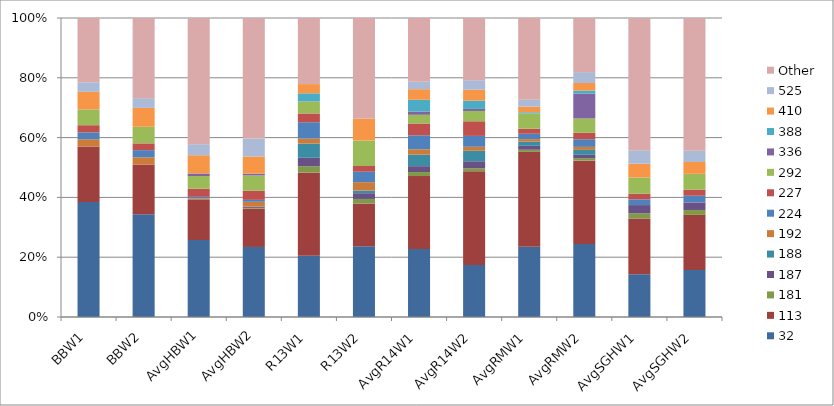
| Category | 32 | 113 | 181 | 187 | 188 | 192 | 224 | 227 | 292 | 336 | 388 | 410 | 525 | Other |
|---|---|---|---|---|---|---|---|---|---|---|---|---|---|---|
| BBW1 | 0.384 | 0.186 | 0 | 0 | 0 | 0.024 | 0.023 | 0.024 | 0.053 | 0 | 0 | 0.059 | 0.032 | 0.215 |
| BBW2 | 0.343 | 0.167 | 0 | 0 | 0 | 0.024 | 0.024 | 0.023 | 0.056 | 0 | 0 | 0.063 | 0.032 | 0.268 |
| AvgHBW1 | 0.258 | 0.134 | 0.001 | 0.002 | 0 | 0.003 | 0.004 | 0.027 | 0.043 | 0.008 | 0 | 0.061 | 0.037 | 0.422 |
| AvgHBW2 | 0.234 | 0.129 | 0.002 | 0.003 | 0.001 | 0.016 | 0.006 | 0.03 | 0.051 | 0.006 | 0 | 0.057 | 0.06 | 0.403 |
| R13W1 | 0.205 | 0.279 | 0.02 | 0.028 | 0.047 | 0.017 | 0.055 | 0.029 | 0.04 | 0 | 0.027 | 0.031 | 0 | 0.221 |
| R13W2 | 0.236 | 0.143 | 0.015 | 0.019 | 0.009 | 0.028 | 0.035 | 0.019 | 0.085 | 0 | 0 | 0.072 | 0 | 0.337 |
| AvgR14W1 | 0.228 | 0.244 | 0.013 | 0.02 | 0.038 | 0.018 | 0.047 | 0.04 | 0.029 | 0.011 | 0.039 | 0.035 | 0.025 | 0.213 |
| AvgR14W2 | 0.174 | 0.314 | 0.01 | 0.023 | 0.035 | 0.013 | 0.036 | 0.049 | 0.034 | 0.007 | 0.028 | 0.037 | 0.032 | 0.208 |
| AvgRMW1 | 0.235 | 0.317 | 0.007 | 0.013 | 0.014 | 0.009 | 0.018 | 0.017 | 0.051 | 0 | 0.004 | 0.019 | 0.023 | 0.273 |
| AvgRMW2 | 0.244 | 0.279 | 0.008 | 0.011 | 0.017 | 0.01 | 0.025 | 0.022 | 0.048 | 0.083 | 0.01 | 0.026 | 0.036 | 0.181 |
| AvgSGHW1 | 0.143 | 0.187 | 0.017 | 0.027 | 0 | 0 | 0.019 | 0.019 | 0.054 | 0 | 0 | 0.046 | 0.045 | 0.443 |
| AvgSGHW2 | 0.157 | 0.184 | 0.016 | 0.025 | 0 | 0 | 0.022 | 0.021 | 0.053 | 0 | 0 | 0.04 | 0.038 | 0.444 |